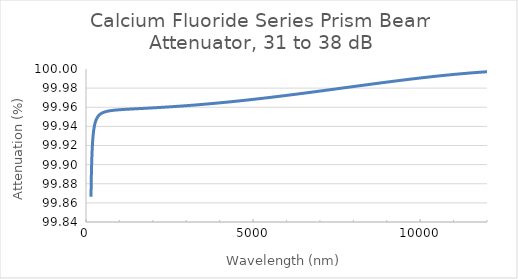
| Category | Calcium Fluoride Series Prism Beam Attenuator, 31 to 38 dB |
|---|---|
| 150.0 | 99.866 |
| 156.70000000000002 | 99.882 |
| 163.70000000000002 | 99.894 |
| 171.1 | 99.903 |
| 178.7 | 99.911 |
| 186.70000000000002 | 99.917 |
| 195.1 | 99.922 |
| 203.8 | 99.927 |
| 213.0 | 99.93 |
| 222.5 | 99.934 |
| 232.5 | 99.936 |
| 242.9 | 99.939 |
| 253.8 | 99.941 |
| 265.2 | 99.943 |
| 277.0 | 99.944 |
| 289.4 | 99.946 |
| 302.4 | 99.947 |
| 315.90000000000003 | 99.948 |
| 330.1 | 99.949 |
| 344.9 | 99.95 |
| 360.3 | 99.95 |
| 376.5 | 99.951 |
| 393.29999999999995 | 99.952 |
| 411.0 | 99.952 |
| 429.4 | 99.953 |
| 448.6 | 99.953 |
| 468.7 | 99.954 |
| 489.70000000000005 | 99.954 |
| 511.6000000000001 | 99.954 |
| 534.5 | 99.955 |
| 558.5 | 99.955 |
| 583.5 | 99.955 |
| 609.6 | 99.956 |
| 637.0 | 99.956 |
| 665.5 | 99.956 |
| 695.3000000000001 | 99.956 |
| 726.4000000000001 | 99.956 |
| 759.0 | 99.957 |
| 793.0 | 99.957 |
| 828.5 | 99.957 |
| 865.6 | 99.957 |
| 904.4 | 99.957 |
| 944.9 | 99.957 |
| 987.1999999999999 | 99.957 |
| 1031.0 | 99.957 |
| 1078.0 | 99.958 |
| 1126.0 | 99.958 |
| 1176.0 | 99.958 |
| 1229.0 | 99.958 |
| 1284.0 | 99.958 |
| 1342.0 | 99.958 |
| 1402.0 | 99.958 |
| 1465.0 | 99.958 |
| 1530.0 | 99.958 |
| 1599.0 | 99.959 |
| 1670.0 | 99.959 |
| 1745.0 | 99.959 |
| 1823.0 | 99.959 |
| 1905.0 | 99.959 |
| 1990.0 | 99.959 |
| 2079.0 | 99.96 |
| 2173.0 | 99.96 |
| 2270.0 | 99.96 |
| 2372.0 | 99.96 |
| 2478.0 | 99.96 |
| 2589.0 | 99.961 |
| 2705.0 | 99.961 |
| 2826.0 | 99.961 |
| 2953.0 | 99.962 |
| 3085.0 | 99.962 |
| 3223.0 | 99.962 |
| 3367.0 | 99.963 |
| 3518.0 | 99.963 |
| 3676.0 | 99.964 |
| 3840.0 | 99.964 |
| 4011.9999999999995 | 99.965 |
| 4192.0 | 99.965 |
| 4380.0 | 99.966 |
| 4576.0 | 99.967 |
| 4781.0 | 99.967 |
| 4995.0 | 99.968 |
| 5219.0 | 99.969 |
| 5453.0 | 99.97 |
| 5697.0 | 99.971 |
| 5952.0 | 99.972 |
| 6219.0 | 99.973 |
| 6498.0 | 99.975 |
| 6789.0 | 99.976 |
| 7093.0 | 99.977 |
| 7410.0 | 99.979 |
| 7742.0 | 99.98 |
| 8089.0 | 99.982 |
| 8452.0 | 99.984 |
| 8830.0 | 99.986 |
| 9226.0 | 99.987 |
| 9639.0 | 99.989 |
| 10070.0 | 99.991 |
| 10520.0 | 99.993 |
| 10990.0 | 99.994 |
| 11490.0 | 99.996 |
| 12000.0 | 99.997 |